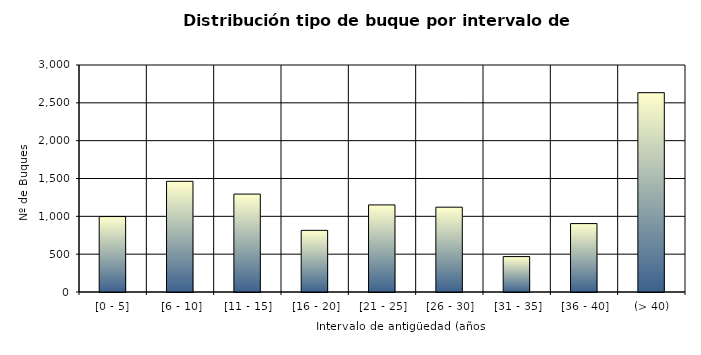
| Category | Series 0 |
|---|---|
| [0 - 5] | 997 |
|  [6 - 10] | 1463 |
|  [11 - 15] | 1294 |
|  [16 - 20] | 815 |
|  [21 - 25] | 1151 |
|  [26 - 30] | 1121 |
|  [31 - 35] | 468 |
|  [36 - 40] | 904 |
|  (> 40) | 2634 |